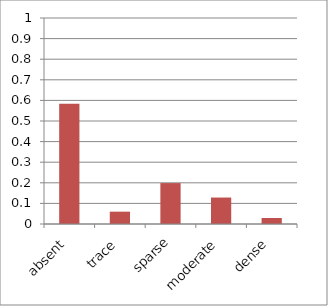
| Category | Val am |
|---|---|
| absent | 0.584 |
| trace | 0.06 |
| sparse | 0.199 |
| moderate | 0.128 |
| dense | 0.029 |